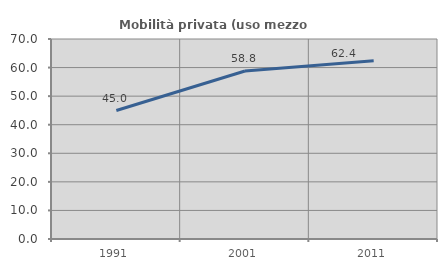
| Category | Mobilità privata (uso mezzo privato) |
|---|---|
| 1991.0 | 44.956 |
| 2001.0 | 58.817 |
| 2011.0 | 62.414 |